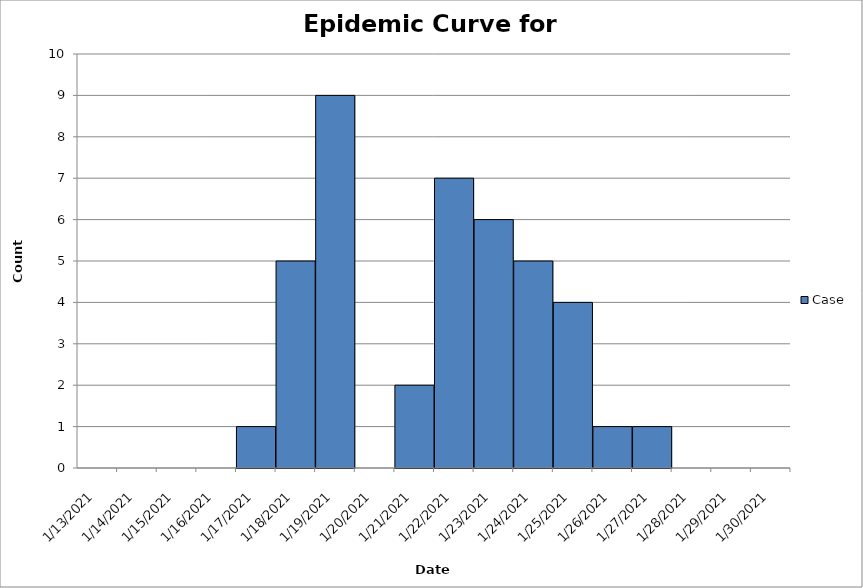
| Category | Case |
|---|---|
| 1/13/21 | 0 |
| 1/14/21 | 0 |
| 1/15/21 | 0 |
| 1/16/21 | 0 |
| 1/17/21 | 1 |
| 1/18/21 | 5 |
| 1/19/21 | 9 |
| 1/20/21 | 0 |
| 1/21/21 | 2 |
| 1/22/21 | 7 |
| 1/23/21 | 6 |
| 1/24/21 | 5 |
| 1/25/21 | 4 |
| 1/26/21 | 1 |
| 1/27/21 | 1 |
| 1/28/21 | 0 |
| 1/29/21 | 0 |
| 1/30/21 | 0 |